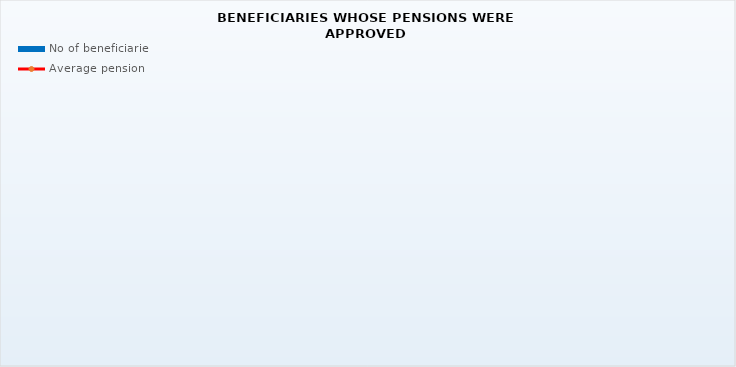
| Category | No of beneficiaries |
|---|---|
| Authorised officials in internal affairs, judicial officers and workers engaged in demining work: | 17264 |
| Active military personnel - DVO  | 15561 |
| Croatian Homeland Army veterans mobilised from 1941 to 1945 | 4426 |
| Former political prisoners | 2897 |
| Croatian Veterans from the Homeland War - ZOHBDR (Act on the Rights of Croatian Homeland War Veterans and their Family Members) | 71243 |
| Pensions approved under general regulations and determined according to the Act on the Rights of Croatian Homeland War Veterans and their Family Members (ZOHBDR), in 2017 (Art. 27, 35, 48 and 49, paragraph 2)    | 40700 |
| Former Yugoslav People's Army members - JNA   | 5664 |
| Former Yugoslav People's Army members - JNA - Art. 185 of Pension Insurance Act (ZOMO)  | 139 |
| National Liberation War veterans - NOR | 10364 |
| Members of the Croatian Parliament, members of the Government, judges of the Constitutional Court and the Auditor General | 672 |
| Members of the Parliamentary Executive Council and administratively retired federal civil servants  (relates to the former SFRY) | 97 |
| Former officials of federal bodies o the former SFRJ -  Article 38 of the Pension Insurance Act (ZOMO) | 34 |
| Full members of the Croatian Academy of Sciences and Arts - HAZU | 144 |
| Miners from the Istrian coal mines "Tupljak" d.d. Labin  | 254 |
| Workers professionally exposed to asbestos | 870 |
| Insurees - crew members on a ship in international and national navigation  - Article  129, paragraph 2 of the Maritime Code | 169 |
| Members of the Croatian Defence Council - HVO  | 6725 |